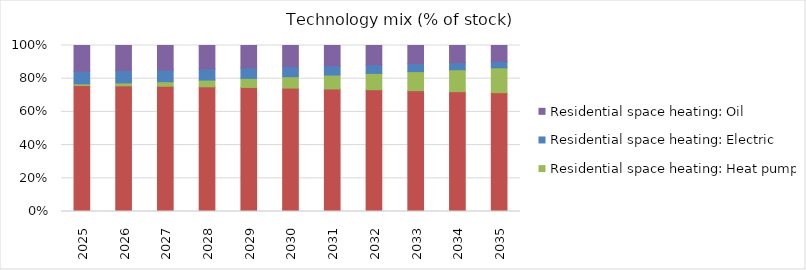
| Category | Residential space heating: Gas | Residential space heating: Heat pump | Residential space heating: Electric | Residential space heating: Oil |
|---|---|---|---|---|
| 2025.0 | 0.759 | 0.009 | 0.076 | 0.155 |
| 2026.0 | 0.757 | 0.018 | 0.074 | 0.152 |
| 2027.0 | 0.755 | 0.027 | 0.071 | 0.148 |
| 2028.0 | 0.751 | 0.04 | 0.067 | 0.141 |
| 2029.0 | 0.747 | 0.055 | 0.063 | 0.135 |
| 2030.0 | 0.743 | 0.069 | 0.059 | 0.129 |
| 2031.0 | 0.738 | 0.084 | 0.055 | 0.123 |
| 2032.0 | 0.734 | 0.098 | 0.052 | 0.116 |
| 2033.0 | 0.728 | 0.115 | 0.047 | 0.11 |
| 2034.0 | 0.722 | 0.132 | 0.043 | 0.103 |
| 2035.0 | 0.716 | 0.15 | 0.039 | 0.096 |